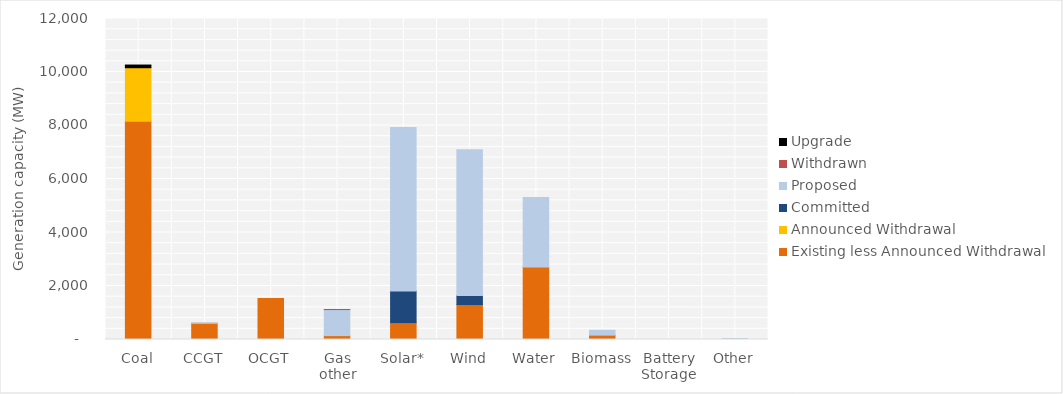
| Category | Existing less Announced Withdrawal | Announced Withdrawal | Committed | Proposed | Withdrawn | Upgrade |
|---|---|---|---|---|---|---|
| Coal | 8160 | 2000 | 0 | 0 | 0 | 100 |
| CCGT | 605.9 | 0 | 0 | 15 | 0 | 0 |
| OCGT | 1530 | 0 | 0 | 0 | 0 | 0 |
| Gas other | 144.46 | 0 | 0 | 975 | 2.8 | 0 |
| Solar* | 632.023 | 0 | 1180.4 | 6109.3 | 0 | 0 |
| Wind | 1307 | 0 | 339.19 | 5446.69 | 0 | 0 |
| Water | 2706.1 | 0 | 0 | 2600 | 0 | 0 |
| Biomass | 162.874 | 0 | 0 | 180.6 | 0 | 0 |
| Battery Storage | 0 | 0 | 0 | 0 | 0 | 0 |
| Other | 9.13 | 0 | 0 | 28.8 | 0 | 0 |